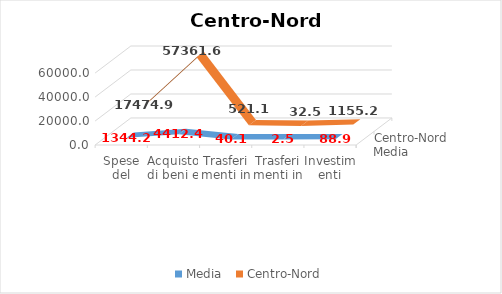
| Category | Media  | Centro-Nord |
|---|---|---|
| Spese del personale | 1344.223 | 17474.898 |
| Acquisto di beni e servizi | 4412.428 | 57361.569 |
| Trasferimenti in c/corrente | 40.082 | 521.07 |
| Trasferimenti in c/capitale | 2.498 | 32.472 |
| Investimenti | 88.859 | 1155.171 |